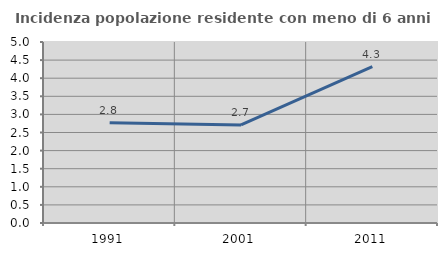
| Category | Incidenza popolazione residente con meno di 6 anni |
|---|---|
| 1991.0 | 2.771 |
| 2001.0 | 2.709 |
| 2011.0 | 4.323 |